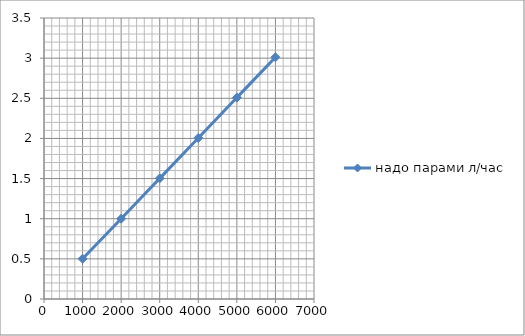
| Category | надо парами л/час |
|---|---|
| 1000.0 | 0.502 |
| 2000.0 | 1 |
| 3000.0 | 1.503 |
| 4000.0 | 2.006 |
| 5000.0 | 2.508 |
| 6000.0 | 3.011 |